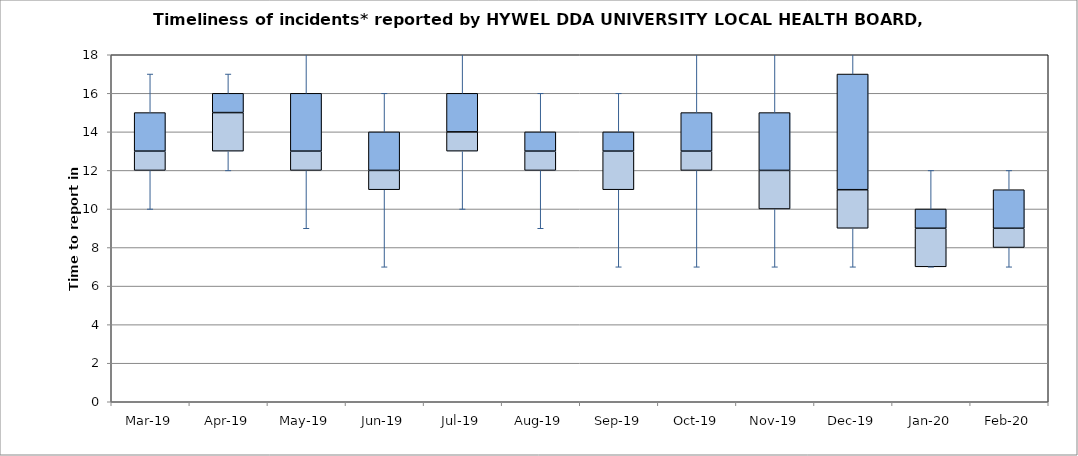
| Category | Series 0 | Series 1 | Series 2 |
|---|---|---|---|
| Mar-19 | 12 | 1 | 2 |
| Apr-19 | 13 | 2 | 1 |
| May-19 | 12 | 1 | 3 |
| Jun-19 | 11 | 1 | 2 |
| Jul-19 | 13 | 1 | 2 |
| Aug-19 | 12 | 1 | 1 |
| Sep-19 | 11 | 2 | 1 |
| Oct-19 | 12 | 1 | 2 |
| Nov-19 | 10 | 2 | 3 |
| Dec-19 | 9 | 2 | 6 |
| Jan-20 | 7 | 2 | 1 |
| Feb-20 | 8 | 1 | 2 |